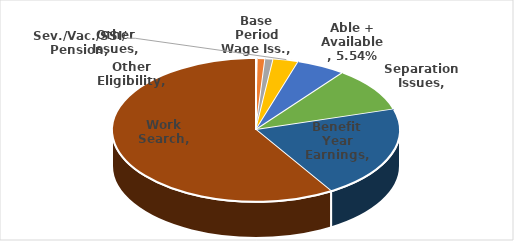
| Category | Series 0 |
|---|---|
| Base Period Wage Iss. | 0.002 |
| Other Issues | 0.009 |
| Other Eligibility | 0.009 |
| Sev./Vac./SSI/ Pension | 0.028 |
| Able + Available | 0.055 |
| Separation Issues | 0.101 |
| Benefit Year Earnings | 0.209 |
| Work Search | 0.587 |